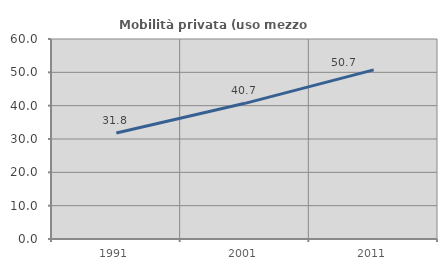
| Category | Mobilità privata (uso mezzo privato) |
|---|---|
| 1991.0 | 31.784 |
| 2001.0 | 40.701 |
| 2011.0 | 50.746 |